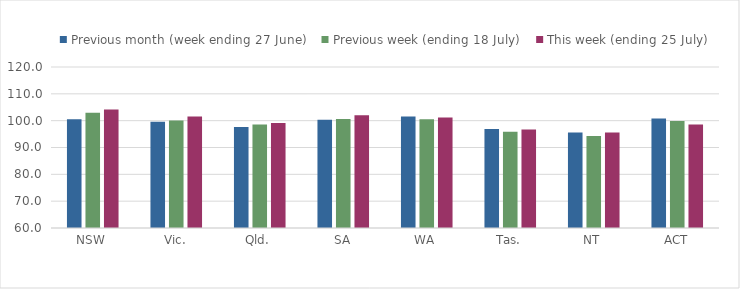
| Category | Previous month (week ending 27 June) | Previous week (ending 18 July) | This week (ending 25 July) |
|---|---|---|---|
| NSW | 100.543 | 102.936 | 104.14 |
| Vic. | 99.588 | 100.107 | 101.526 |
| Qld. | 97.668 | 98.597 | 99.173 |
| SA | 100.316 | 100.594 | 102.024 |
| WA | 101.526 | 100.529 | 101.203 |
| Tas. | 96.905 | 95.842 | 96.739 |
| NT | 95.563 | 94.264 | 95.597 |
| ACT | 100.772 | 99.846 | 98.559 |